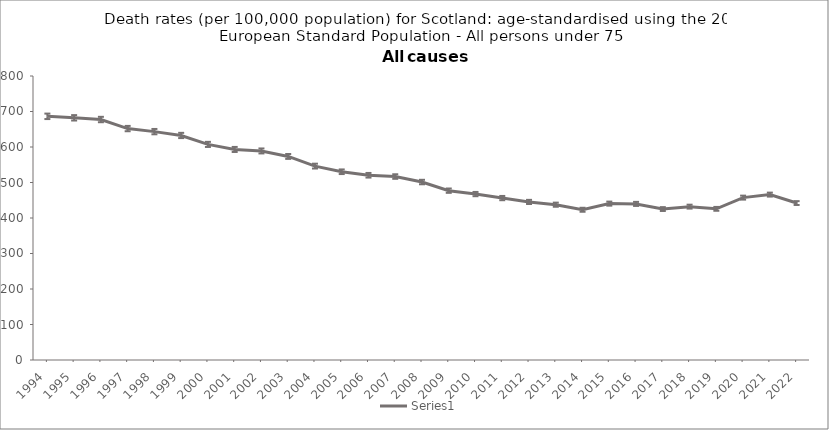
| Category | Series 0 |
|---|---|
| 1994.0 | 686.4 |
| 1995.0 | 682.2 |
| 1996.0 | 677.4 |
| 1997.0 | 651.9 |
| 1998.0 | 643.3 |
| 1999.0 | 632.5 |
| 2000.0 | 607.3 |
| 2001.0 | 593.1 |
| 2002.0 | 588.9 |
| 2003.0 | 573.4 |
| 2004.0 | 546.2 |
| 2005.0 | 530.3 |
| 2006.0 | 520.4 |
| 2007.0 | 516.8 |
| 2008.0 | 501.3 |
| 2009.0 | 477 |
| 2010.0 | 467.4 |
| 2011.0 | 456.1 |
| 2012.0 | 445.3 |
| 2013.0 | 437.5 |
| 2014.0 | 423.2 |
| 2015.0 | 440.5 |
| 2016.0 | 439.7 |
| 2017.0 | 425.2 |
| 2018.0 | 432 |
| 2019.0 | 425.8 |
| 2020.0 | 457.4 |
| 2021.0 | 465.9 |
| 2022.0 | 442.1 |